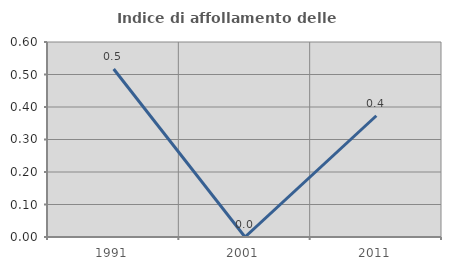
| Category | Indice di affollamento delle abitazioni  |
|---|---|
| 1991.0 | 0.517 |
| 2001.0 | 0 |
| 2011.0 | 0.373 |